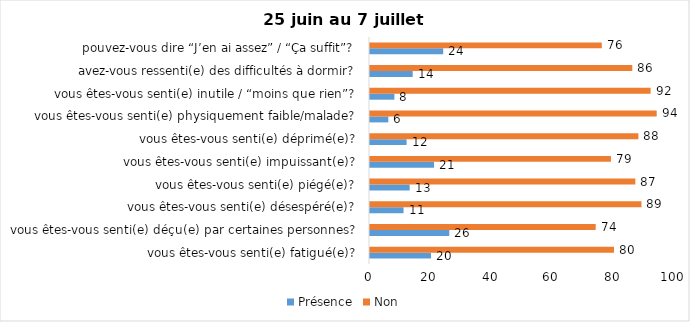
| Category | Présence | Non |
|---|---|---|
| vous êtes-vous senti(e) fatigué(e)? | 20 | 80 |
| vous êtes-vous senti(e) déçu(e) par certaines personnes? | 26 | 74 |
| vous êtes-vous senti(e) désespéré(e)? | 11 | 89 |
| vous êtes-vous senti(e) piégé(e)? | 13 | 87 |
| vous êtes-vous senti(e) impuissant(e)? | 21 | 79 |
| vous êtes-vous senti(e) déprimé(e)? | 12 | 88 |
| vous êtes-vous senti(e) physiquement faible/malade? | 6 | 94 |
| vous êtes-vous senti(e) inutile / “moins que rien”? | 8 | 92 |
| avez-vous ressenti(e) des difficultés à dormir? | 14 | 86 |
| pouvez-vous dire “J’en ai assez” / “Ça suffit”? | 24 | 76 |